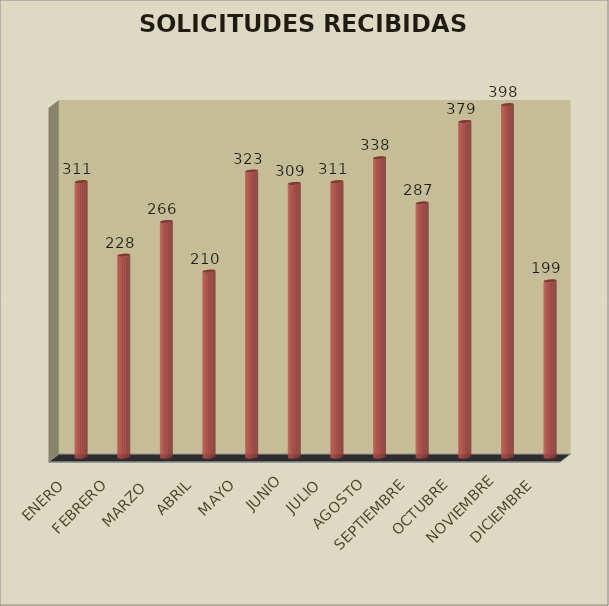
| Category | Series 0 | Series 1 |
|---|---|---|
| ENERO |  | 311 |
| FEBRERO |  | 228 |
| MARZO  |  | 266 |
| ABRIL |  | 210 |
| MAYO |  | 323 |
| JUNIO |  | 309 |
| JULIO |  | 311 |
| AGOSTO |  | 338 |
| SEPTIEMBRE |  | 287 |
| OCTUBRE |  | 379 |
| NOVIEMBRE |  | 398 |
| DICIEMBRE |  | 199 |